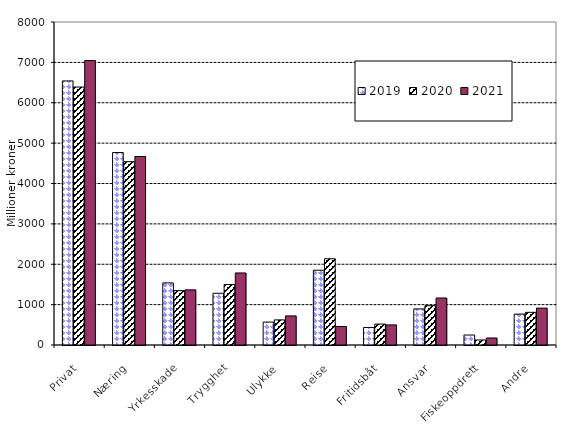
| Category | 2019 | 2020 | 2021 |
|---|---|---|---|
| Privat | 6540.864 | 6389.024 | 7045.66 |
| Næring | 4767.2 | 4539.877 | 4668.555 |
| Yrkesskade | 1538.096 | 1346.565 | 1366.204 |
| Trygghet | 1281.184 | 1496.949 | 1784.325 |
| Ulykke | 567.358 | 621.675 | 720.864 |
| Reise | 1851.683 | 2135.98 | 459.278 |
| Fritidsbåt | 434.722 | 517.485 | 498.321 |
| Ansvar | 893.738 | 973.351 | 1164.283 |
| Fiskeoppdrett | 247.178 | 124.359 | 173.799 |
| Andre | 765.396 | 808.908 | 914.046 |